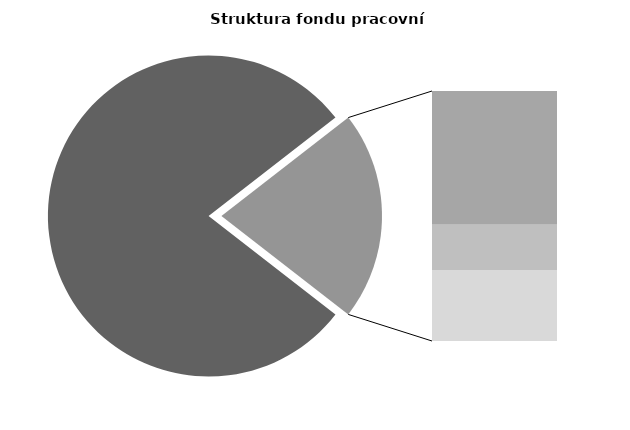
| Category | Series 0 |
|---|---|
| Průměrná měsíční odpracovaná doba bez přesčasu | 136.258 |
| Dovolená | 19.384 |
| Nemoc | 6.568 |
| Jiné | 10.274 |